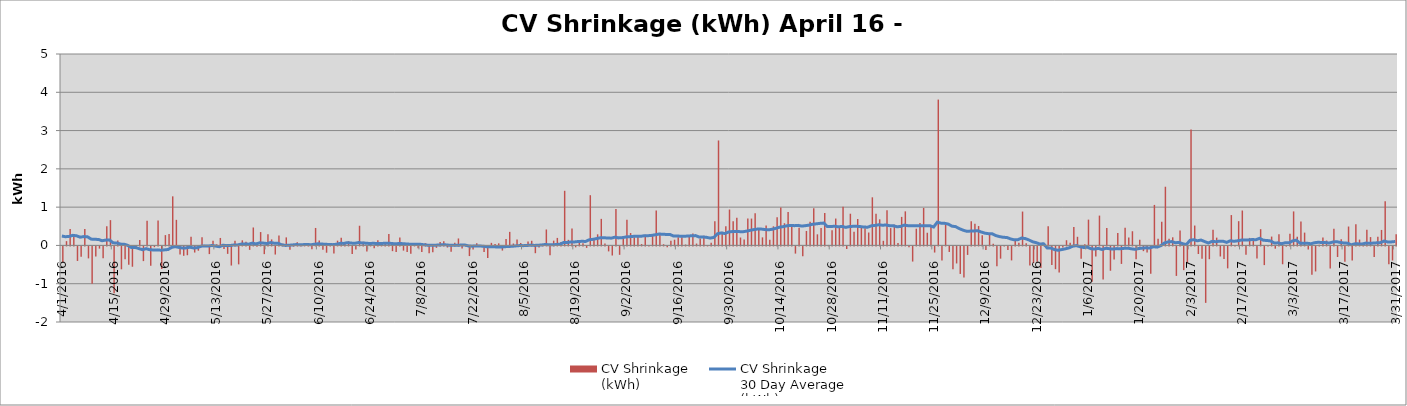
| Category | CV Shrinkage
(kWh) |
|---|---|
| 4/1/16 | -415971 |
| 4/2/16 | 112164 |
| 4/3/16 | 426455 |
| 4/4/16 | 238382 |
| 4/5/16 | -379282 |
| 4/6/16 | -267183 |
| 4/7/16 | 426798 |
| 4/8/16 | -312313 |
| 4/9/16 | -977879 |
| 4/10/16 | -265045 |
| 4/11/16 | -57626 |
| 4/12/16 | -310336 |
| 4/13/16 | 502100 |
| 4/14/16 | 660666 |
| 4/15/16 | -1219880 |
| 4/16/16 | 125694 |
| 4/17/16 | -597395 |
| 4/18/16 | -334656 |
| 4/19/16 | -476175 |
| 4/20/16 | -530546 |
| 4/21/16 | -47844 |
| 4/22/16 | 143159 |
| 4/23/16 | -383456 |
| 4/24/16 | 646488 |
| 4/25/16 | -503022 |
| 4/26/16 | -19725 |
| 4/27/16 | 648787 |
| 4/28/16 | -591487 |
| 4/29/16 | 269549 |
| 4/30/16 | 299580 |
| 5/1/16 | 1282156 |
| 5/2/16 | 668251 |
| 5/3/16 | -212614 |
| 5/4/16 | -245069 |
| 5/5/16 | -230174 |
| 5/6/16 | 228288 |
| 5/7/16 | -159701 |
| 5/8/16 | -112015 |
| 5/9/16 | 212416 |
| 5/10/16 | -4389 |
| 5/11/16 | -200189 |
| 5/12/16 | 121031 |
| 5/13/16 | 30299 |
| 5/14/16 | 195461 |
| 5/15/16 | -67666 |
| 5/16/16 | -194113 |
| 5/17/16 | -499404 |
| 5/18/16 | 122370 |
| 5/19/16 | -468483 |
| 5/20/16 | 133491 |
| 5/21/16 | 94134 |
| 5/22/16 | -89953 |
| 5/23/16 | 468834 |
| 5/24/16 | -7962 |
| 5/25/16 | 349301 |
| 5/26/16 | -201191 |
| 5/27/16 | 294212 |
| 5/28/16 | 157015 |
| 5/29/16 | -211810 |
| 5/30/16 | 256082 |
| 5/31/16 | 46743 |
| 6/1/16 | 210114 |
| 6/2/16 | -84777 |
| 6/3/16 | -6510 |
| 6/4/16 | 80833 |
| 6/5/16 | 5244 |
| 6/6/16 | 13991 |
| 6/7/16 | 39645 |
| 6/8/16 | -73481 |
| 6/9/16 | 456383 |
| 6/10/16 | 127228 |
| 6/11/16 | -84335 |
| 6/12/16 | -164460 |
| 6/13/16 | 33437 |
| 6/14/16 | -184799 |
| 6/15/16 | 124580 |
| 6/16/16 | 200028 |
| 6/17/16 | 83426 |
| 6/18/16 | 109493 |
| 6/19/16 | -199740 |
| 6/20/16 | -80943 |
| 6/21/16 | 513953 |
| 6/22/16 | 98588 |
| 6/23/16 | -130847 |
| 6/24/16 | 85400 |
| 6/25/16 | -44343 |
| 6/26/16 | 137803 |
| 6/27/16 | 64479 |
| 6/28/16 | 66376 |
| 6/29/16 | 296125 |
| 6/30/16 | -123435 |
| 7/1/16 | -144717 |
| 7/2/16 | 204436 |
| 7/3/16 | -109147 |
| 7/4/16 | -146085 |
| 7/5/16 | -189272 |
| 7/6/16 | 52844 |
| 7/7/16 | -45995 |
| 7/8/16 | -147543 |
| 7/9/16 | 59501 |
| 7/10/16 | -180050 |
| 7/11/16 | -149399 |
| 7/12/16 | -36279 |
| 7/13/16 | 92302 |
| 7/14/16 | 106347 |
| 7/15/16 | -29300 |
| 7/16/16 | -135769 |
| 7/17/16 | 67319 |
| 7/18/16 | 182156 |
| 7/19/16 | -51460 |
| 7/20/16 | 3342 |
| 7/21/16 | -252179 |
| 7/22/16 | -78369 |
| 7/23/16 | 54692 |
| 7/24/16 | -12908 |
| 7/25/16 | -148126 |
| 7/26/16 | -302679 |
| 7/27/16 | 67467 |
| 7/28/16 | 39744 |
| 7/29/16 | 55031 |
| 7/30/16 | -108299 |
| 7/31/16 | 164889 |
| 8/1/16 | 354410 |
| 8/2/16 | 49989 |
| 8/3/16 | 156398 |
| 8/4/16 | 64339 |
| 8/5/16 | -14170 |
| 8/6/16 | 102553 |
| 8/7/16 | 121319 |
| 8/8/16 | -177022 |
| 8/9/16 | -30311 |
| 8/10/16 | 34603 |
| 8/11/16 | 416512 |
| 8/12/16 | -229635 |
| 8/13/16 | 125010 |
| 8/14/16 | 196585 |
| 8/15/16 | 87944 |
| 8/16/16 | 1426980 |
| 8/17/16 | 146049 |
| 8/18/16 | 440221 |
| 8/19/16 | -23383 |
| 8/20/16 | 105716 |
| 8/21/16 | 55645 |
| 8/22/16 | -37369 |
| 8/23/16 | 1312159 |
| 8/24/16 | 177723 |
| 8/25/16 | 290377 |
| 8/26/16 | 693969 |
| 8/27/16 | 48022 |
| 8/28/16 | -129816 |
| 8/29/16 | -237191 |
| 8/30/16 | 948939 |
| 8/31/16 | -219146 |
| 9/1/16 | 238431 |
| 9/2/16 | 669793 |
| 9/3/16 | 323662 |
| 9/4/16 | 215654 |
| 9/5/16 | 232238 |
| 9/6/16 | 35821 |
| 9/7/16 | 279221 |
| 9/8/16 | 99 |
| 9/9/16 | 266227 |
| 9/10/16 | 912606 |
| 9/11/16 | 323203 |
| 9/12/16 | 30912 |
| 9/13/16 | -24091 |
| 9/14/16 | 119550 |
| 9/15/16 | 149475 |
| 9/16/16 | 214141 |
| 9/17/16 | 211842 |
| 9/18/16 | 24222 |
| 9/19/16 | 228951 |
| 9/20/16 | 308366 |
| 9/21/16 | 49073 |
| 9/22/16 | 181858 |
| 9/23/16 | 252769 |
| 9/24/16 | 2437 |
| 9/25/16 | 71095 |
| 9/26/16 | 634668 |
| 9/27/16 | 2741476 |
| 9/28/16 | 356737 |
| 9/29/16 | 502252 |
| 9/30/16 | 938046 |
| 10/1/16 | 631574 |
| 10/2/16 | 720882 |
| 10/3/16 | 206701 |
| 10/4/16 | 153573 |
| 10/5/16 | 706530 |
| 10/6/16 | 701514 |
| 10/7/16 | 843580 |
| 10/8/16 | 400014 |
| 10/9/16 | 210625 |
| 10/10/16 | 519223 |
| 10/11/16 | 148685 |
| 10/12/16 | 499156 |
| 10/13/16 | 735278 |
| 10/14/16 | 991935 |
| 10/15/16 | 580068 |
| 10/16/16 | 872893 |
| 10/17/16 | 484936 |
| 10/18/16 | -187511 |
| 10/19/16 | 460065 |
| 10/20/16 | -256067 |
| 10/21/16 | 377832 |
| 10/22/16 | 619949 |
| 10/23/16 | 968461 |
| 10/24/16 | 290013 |
| 10/25/16 | 455998 |
| 10/26/16 | 850019 |
| 10/27/16 | 12532 |
| 10/28/16 | 395561 |
| 10/29/16 | 702171 |
| 10/30/16 | 459242 |
| 10/31/16 | 1012096 |
| 11/1/16 | -67455 |
| 11/2/16 | 828219 |
| 11/3/16 | 358743 |
| 11/4/16 | 691074 |
| 11/5/16 | 508154 |
| 11/6/16 | 450277 |
| 11/7/16 | 337513 |
| 11/8/16 | 1256612 |
| 11/9/16 | 829719 |
| 11/10/16 | 681551 |
| 11/11/16 | 120641 |
| 11/12/16 | 917834 |
| 11/13/16 | 453340 |
| 11/14/16 | 544073 |
| 11/15/16 | 61398 |
| 11/16/16 | 745559 |
| 11/17/16 | 889947 |
| 11/18/16 | -20827 |
| 11/19/16 | -395329 |
| 11/20/16 | 436958 |
| 11/21/16 | 586446 |
| 11/22/16 | 979414 |
| 11/23/16 | 331259 |
| 11/24/16 | 480100 |
| 11/25/16 | -159482 |
| 11/26/16 | 3809271 |
| 11/27/16 | -369969 |
| 11/28/16 | 562224 |
| 11/29/16 | -144356 |
| 11/30/16 | -597235 |
| 12/1/16 | -444638 |
| 12/2/16 | -718594 |
| 12/3/16 | -809453 |
| 12/4/16 | -222119 |
| 12/5/16 | 630954 |
| 12/6/16 | 565802 |
| 12/7/16 | 506447 |
| 12/8/16 | 267838 |
| 12/9/16 | -92149 |
| 12/10/16 | 291126 |
| 12/11/16 | 41045 |
| 12/12/16 | -519923 |
| 12/13/16 | -319276 |
| 12/14/16 | 5222 |
| 12/15/16 | -94548 |
| 12/16/16 | -365342 |
| 12/17/16 | 171161 |
| 12/18/16 | 69546 |
| 12/19/16 | 884841 |
| 12/20/16 | 58773 |
| 12/21/16 | -495373 |
| 12/22/16 | -434798 |
| 12/23/16 | -399880 |
| 12/24/16 | -564200 |
| 12/25/16 | 44629 |
| 12/26/16 | 498146 |
| 12/27/16 | -482527 |
| 12/28/16 | -594098 |
| 12/29/16 | -681819 |
| 12/30/16 | -26947 |
| 12/31/16 | 135864 |
| 1/1/17 | 67935 |
| 1/2/17 | 482899 |
| 1/3/17 | 225379 |
| 1/4/17 | -321703 |
| 1/5/17 | 33034 |
| 1/6/17 | 673979 |
| 1/7/17 | -919948 |
| 1/8/17 | -263551 |
| 1/9/17 | 779305 |
| 1/10/17 | -866661 |
| 1/11/17 | 452773 |
| 1/12/17 | -635223 |
| 1/13/17 | -341891 |
| 1/14/17 | 323637 |
| 1/15/17 | -456714 |
| 1/16/17 | 460726 |
| 1/17/17 | 209020 |
| 1/18/17 | 370558 |
| 1/19/17 | -338084 |
| 1/20/17 | 148058 |
| 1/21/17 | -123071 |
| 1/22/17 | -156290 |
| 1/23/17 | -710696 |
| 1/24/17 | 1058499 |
| 1/25/17 | 173922 |
| 1/26/17 | 618775 |
| 1/27/17 | 1533014 |
| 1/28/17 | 174118 |
| 1/29/17 | 212227 |
| 1/30/17 | -769857 |
| 1/31/17 | 389271 |
| 2/1/17 | -619218 |
| 2/2/17 | -433362 |
| 2/3/17 | 3031010 |
| 2/4/17 | 519269 |
| 2/5/17 | -197959 |
| 2/6/17 | -320102 |
| 2/7/17 | -1474058 |
| 2/8/17 | -334265 |
| 2/9/17 | 406449 |
| 2/10/17 | 203512 |
| 2/11/17 | -262499 |
| 2/12/17 | -331218 |
| 2/13/17 | -573212 |
| 2/14/17 | 793027 |
| 2/15/17 | 11933 |
| 2/16/17 | 633642 |
| 2/17/17 | 911973 |
| 2/18/17 | -218056 |
| 2/19/17 | 196175 |
| 2/20/17 | 146453 |
| 2/21/17 | -314616 |
| 2/22/17 | 425020 |
| 2/23/17 | -487864 |
| 2/24/17 | 13945 |
| 2/25/17 | 231345 |
| 2/26/17 | -59177 |
| 2/27/17 | 290100 |
| 2/28/17 | -465562 |
| 3/1/17 | -5654 |
| 3/2/17 | 304295 |
| 3/3/17 | 888625 |
| 3/4/17 | 229823 |
| 3/5/17 | 626187 |
| 3/6/17 | 334857 |
| 3/7/17 | -80679 |
| 3/8/17 | -736542 |
| 3/9/17 | -653892 |
| 3/10/17 | 17749 |
| 3/11/17 | 209813 |
| 3/12/17 | 128195 |
| 3/13/17 | -577289 |
| 3/14/17 | 435383 |
| 3/15/17 | -275728 |
| 3/16/17 | 160650 |
| 3/17/17 | -401126 |
| 3/18/17 | 493695 |
| 3/19/17 | -369612 |
| 3/20/17 | 553638 |
| 3/21/17 | 152453 |
| 3/22/17 | 39974 |
| 3/23/17 | 409311 |
| 3/24/17 | 218097 |
| 3/25/17 | -278904 |
| 3/26/17 | 223649 |
| 3/27/17 | 404631 |
| 3/28/17 | 1153592 |
| 3/29/17 | -466622 |
| 3/30/17 | -367628 |
| 3/31/17 | 292765 |